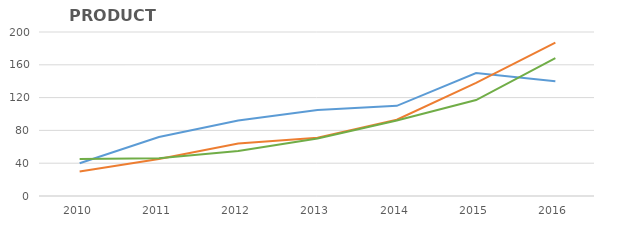
| Category | Jellies | Cakes | Fruits | Chocolates | Creams | Icecreams |
|---|---|---|---|---|---|---|
| 2010.0 | 40 | 30 |  |  |  | 45 |
| 2011.0 | 72 | 45 |  |  |  | 46 |
| 2012.0 | 92 | 64 |  |  |  | 55 |
| 2013.0 | 105 | 71 |  |  |  | 70 |
| 2014.0 | 110 | 93 |  |  |  | 92 |
| 2015.0 | 150 | 138 |  |  |  | 117 |
| 2016.0 | 140 | 187 |  |  |  | 168 |